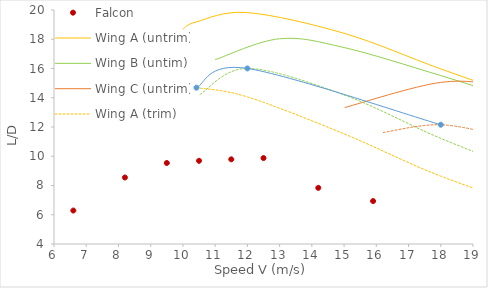
| Category | Falcon |
|---|---|
| 6.6 | 6.288 |
| 8.2 | 8.547 |
| 9.5 | 9.539 |
| 10.5 | 9.688 |
| 11.5 | 9.79 |
| 12.5 | 9.876 |
| 14.2 | 7.84 |
| 15.9 | 6.935 |